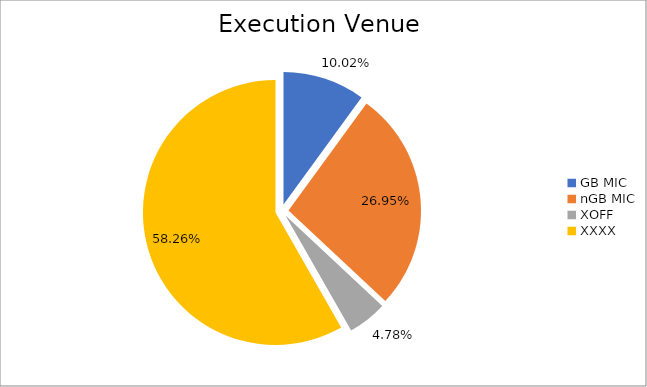
| Category | Series 0 |
|---|---|
| GB MIC | 1009913.669 |
| nGB MIC | 2717037.808 |
| XOFF | 481763.409 |
| XXXX | 5873654.204 |